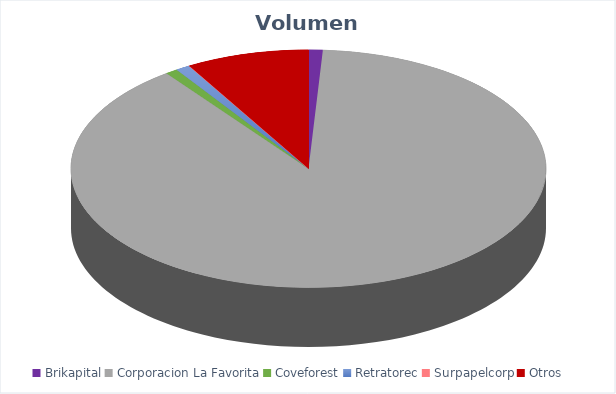
| Category | VOLUMEN ($USD) |
|---|---|
| Brikapital | 3000 |
| Corporacion La Favorita | 277074.82 |
| Coveforest | 2600 |
| Retratorec | 3010 |
| Surpapelcorp | 63.75 |
| Otros | 26078.4 |